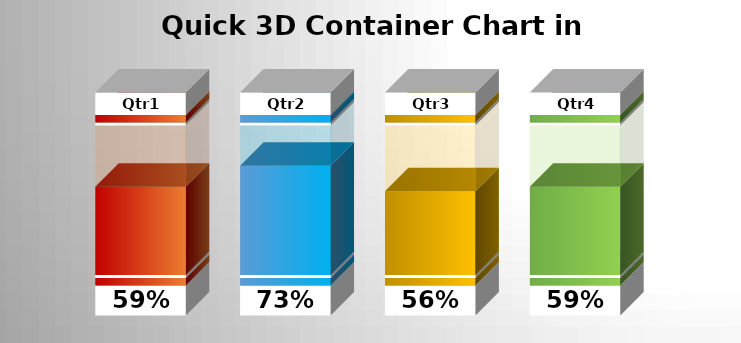
| Category | Lower Cap | Middle Line1 | Middle Line2 | Service Level | Blank | Upper Cap |
|---|---|---|---|---|---|---|
| Qtr1 | 0.2 | 0.05 | 0.02 | 0.59 | 0.41 | 0.15 |
| Qtr2 | 0.2 | 0.05 | 0.02 | 0.73 | 0.27 | 0.15 |
| Qtr3 | 0.2 | 0.05 | 0.02 | 0.56 | 0.44 | 0.15 |
| Qtr4 | 0.2 | 0.05 | 0.02 | 0.59 | 0.41 | 0.15 |